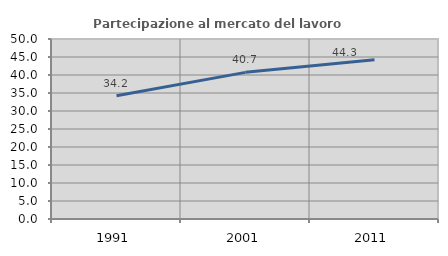
| Category | Partecipazione al mercato del lavoro  femminile |
|---|---|
| 1991.0 | 34.225 |
| 2001.0 | 40.732 |
| 2011.0 | 44.258 |